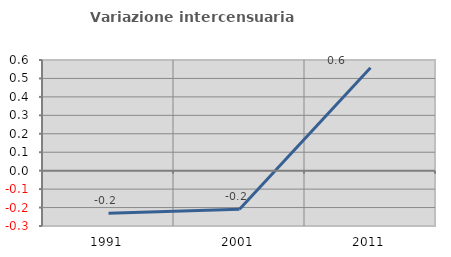
| Category | Variazione intercensuaria annua |
|---|---|
| 1991.0 | -0.231 |
| 2001.0 | -0.209 |
| 2011.0 | 0.558 |